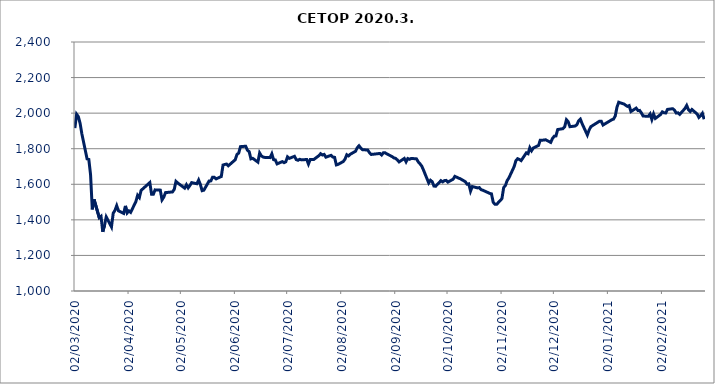
| Category | CETOP |
|---|---|
| 02/03/2020 | 1915.812 |
| 03/03/2020 | 1994.418 |
| 04/03/2020 | 1980.79 |
| 05/03/2020 | 1942.986 |
| 06/03/2020 | 1884.333 |
| 09/03/2020 | 1742.838 |
| 10/03/2020 | 1739.523 |
| 11/03/2020 | 1654.414 |
| 12/03/2020 | 1458.928 |
| 13/03/2020 | 1515.225 |
| 16/03/2020 | 1411.769 |
| 17/03/2020 | 1419.91 |
| 18/03/2020 | 1332.932 |
| 19/03/2020 | 1368.187 |
| 20/03/2020 | 1416.41 |
| 23/03/2020 | 1360.369 |
| 24/03/2020 | 1437.401 |
| 25/03/2020 | 1453.309 |
| 26/03/2020 | 1479.751 |
| 27/03/2020 | 1451.143 |
| 30/03/2020 | 1436.146 |
| 31/03/2020 | 1478.335 |
| 01/04/2020 | 1438.695 |
| 02/04/2020 | 1450.204 |
| 03/04/2020 | 1442.017 |
| 06/04/2020 | 1502.86 |
| 07/04/2020 | 1538.196 |
| 08/04/2020 | 1525.629 |
| 09/04/2020 | 1565.773 |
| 14/04/2020 | 1609.72 |
| 15/04/2020 | 1543.88 |
| 16/04/2020 | 1543.605 |
| 17/04/2020 | 1568.537 |
| 20/04/2020 | 1567.205 |
| 21/04/2020 | 1512.555 |
| 22/04/2020 | 1527.397 |
| 23/04/2020 | 1553.266 |
| 24/04/2020 | 1554.205 |
| 27/04/2020 | 1557.059 |
| 28/04/2020 | 1571.111 |
| 29/04/2020 | 1616.213 |
| 30/04/2020 | 1607.348 |
| 04/05/2020 | 1578.397 |
| 05/05/2020 | 1597.273 |
| 06/05/2020 | 1579.815 |
| 07/05/2020 | 1593.268 |
| 08/05/2020 | 1609.292 |
| 11/05/2020 | 1603.122 |
| 12/05/2020 | 1623.87 |
| 13/05/2020 | 1598.749 |
| 14/05/2020 | 1564.22 |
| 15/05/2020 | 1566.861 |
| 18/05/2020 | 1618.529 |
| 19/05/2020 | 1619.111 |
| 20/05/2020 | 1639.367 |
| 21/05/2020 | 1639.154 |
| 22/05/2020 | 1630.312 |
| 25/05/2020 | 1643.693 |
| 26/05/2020 | 1708.393 |
| 27/05/2020 | 1711.519 |
| 28/05/2020 | 1713.511 |
| 29/05/2020 | 1703.799 |
| 02/06/2020 | 1738.033 |
| 03/06/2020 | 1767.743 |
| 04/06/2020 | 1775.711 |
| 05/06/2020 | 1811.737 |
| 08/06/2020 | 1813.982 |
| 09/06/2020 | 1791.302 |
| 10/06/2020 | 1783.398 |
| 11/06/2020 | 1742.986 |
| 12/06/2020 | 1746.093 |
| 15/06/2020 | 1724.651 |
| 16/06/2020 | 1775.957 |
| 17/06/2020 | 1759.579 |
| 18/06/2020 | 1753.19 |
| 19/06/2020 | 1751.005 |
| 22/06/2020 | 1749.943 |
| 23/06/2020 | 1771.235 |
| 24/06/2020 | 1738.519 |
| 25/06/2020 | 1736.87 |
| 26/06/2020 | 1714.63 |
| 29/06/2020 | 1727.612 |
| 30/06/2020 | 1721.529 |
| 01/07/2020 | 1726.48 |
| 02/07/2020 | 1754.17 |
| 03/07/2020 | 1745.57 |
| 06/07/2020 | 1757.27 |
| 07/07/2020 | 1738.74 |
| 08/07/2020 | 1734.92 |
| 09/07/2020 | 1740.65 |
| 10/07/2020 | 1737.19 |
| 13/07/2020 | 1739.55 |
| 14/07/2020 | 1713.88 |
| 15/07/2020 | 1738.95 |
| 16/07/2020 | 1738.81 |
| 17/07/2020 | 1739.1 |
| 20/07/2020 | 1760.93 |
| 21/07/2020 | 1771.93 |
| 22/07/2020 | 1764.82 |
| 23/07/2020 | 1768 |
| 24/07/2020 | 1752.47 |
| 27/07/2020 | 1762.87 |
| 28/07/2020 | 1752.88 |
| 29/07/2020 | 1751.47 |
| 30/07/2020 | 1708.97 |
| 31/07/2020 | 1711.86 |
| 03/08/2020 | 1728.22 |
| 04/08/2020 | 1741.69 |
| 05/08/2020 | 1766.08 |
| 06/08/2020 | 1759.78 |
| 07/08/2020 | 1768.96 |
| 10/08/2020 | 1785.56 |
| 11/08/2020 | 1805.56 |
| 12/08/2020 | 1816.49 |
| 13/08/2020 | 1803.72 |
| 14/08/2020 | 1794.65 |
| 17/08/2020 | 1792.48 |
| 18/08/2020 | 1777.96 |
| 19/08/2020 | 1767.61 |
| 24/08/2020 | 1773.39 |
| 25/08/2020 | 1764.63 |
| 26/08/2020 | 1777.66 |
| 27/08/2020 | 1777.01 |
| 28/08/2020 | 1770.77 |
| 31/08/2020 | 1755.77 |
| 01/09/2020 | 1748.37 |
| 02/09/2020 | 1745.97 |
| 03/09/2020 | 1736.96 |
| 04/09/2020 | 1725.76 |
| 07/09/2020 | 1745.26 |
| 08/09/2020 | 1726.14 |
| 09/09/2020 | 1744.68 |
| 10/09/2020 | 1740.62 |
| 11/09/2020 | 1745.4 |
| 14/09/2020 | 1742.94 |
| 15/09/2020 | 1725.91 |
| 16/09/2020 | 1714.94 |
| 17/09/2020 | 1702.37 |
| 18/09/2020 | 1679.96 |
| 21/09/2020 | 1607.52 |
| 22/09/2020 | 1622.46 |
| 23/09/2020 | 1614.64 |
| 24/09/2020 | 1589.92 |
| 25/09/2020 | 1589.21 |
| 28/09/2020 | 1620.39 |
| 29/09/2020 | 1613.59 |
| 30/09/2020 | 1620.54 |
| 01/10/2020 | 1621.82 |
| 02/10/2020 | 1612.25 |
| 05/10/2020 | 1628.6 |
| 06/10/2020 | 1644.52 |
| 07/10/2020 | 1640.1 |
| 08/10/2020 | 1635.1 |
| 09/10/2020 | 1631.81 |
| 12/10/2020 | 1614.4 |
| 13/10/2020 | 1600.31 |
| 14/10/2020 | 1602.42 |
| 15/10/2020 | 1561.73 |
| 16/10/2020 | 1587.3 |
| 19/10/2020 | 1579.8 |
| 20/10/2020 | 1581.44 |
| 21/10/2020 | 1570.12 |
| 22/10/2020 | 1566.79 |
| 26/10/2020 | 1548.79 |
| 27/10/2020 | 1546.15 |
| 28/10/2020 | 1498.86 |
| 29/10/2020 | 1487.64 |
| 30/10/2020 | 1487.52 |
| 02/11/2020 | 1519.19 |
| 03/11/2020 | 1581.46 |
| 04/11/2020 | 1593.28 |
| 05/11/2020 | 1620.79 |
| 06/11/2020 | 1635.85 |
| 09/11/2020 | 1699.08 |
| 10/11/2020 | 1732.26 |
| 11/11/2020 | 1743.66 |
| 12/11/2020 | 1739.7 |
| 13/11/2020 | 1733.07 |
| 16/11/2020 | 1776.66 |
| 17/11/2020 | 1772.01 |
| 18/11/2020 | 1805.8 |
| 19/11/2020 | 1788.54 |
| 20/11/2020 | 1803.8 |
| 23/11/2020 | 1818.56 |
| 24/11/2020 | 1848.16 |
| 25/11/2020 | 1847.99 |
| 26/11/2020 | 1848.47 |
| 27/11/2020 | 1850.47 |
| 30/11/2020 | 1835.59 |
| 01/12/2020 | 1857.61 |
| 02/12/2020 | 1870.38 |
| 03/12/2020 | 1871.91 |
| 04/12/2020 | 1907.87 |
| 07/12/2020 | 1912.65 |
| 08/12/2020 | 1922.85 |
| 09/12/2020 | 1962.8 |
| 10/12/2020 | 1952.45 |
| 11/12/2020 | 1923.82 |
| 14/12/2020 | 1927.53 |
| 15/12/2020 | 1935.14 |
| 16/12/2020 | 1956.56 |
| 17/12/2020 | 1965.92 |
| 18/12/2020 | 1940.88 |
| 21/12/2020 | 1877.07 |
| 22/12/2020 | 1904.82 |
| 23/12/2020 | 1923.84 |
| 28/12/2020 | 1954.78 |
| 29/12/2020 | 1954.29 |
| 30/12/2020 | 1933.266 |
| 04/01/2021 | 1962.73 |
| 05/01/2021 | 1966.43 |
| 06/01/2021 | 1983.41 |
| 07/01/2021 | 2033.28 |
| 08/01/2021 | 2061.34 |
| 11/01/2021 | 2051.33 |
| 12/01/2021 | 2044.47 |
| 13/01/2021 | 2037.86 |
| 14/01/2021 | 2042.29 |
| 15/01/2021 | 2009.01 |
| 18/01/2021 | 2028.23 |
| 19/01/2021 | 2015.22 |
| 20/01/2021 | 2015.5 |
| 21/01/2021 | 2001.38 |
| 22/01/2021 | 1983.77 |
| 25/01/2021 | 1982.05 |
| 26/01/2021 | 1995.48 |
| 27/01/2021 | 1964.21 |
| 28/01/2021 | 1995.54 |
| 29/01/2021 | 1970.38 |
| 01/02/2021 | 1991.99 |
| 02/02/2021 | 2007.22 |
| 03/02/2021 | 2001.98 |
| 04/02/2021 | 2000.87 |
| 05/02/2021 | 2021.06 |
| 08/02/2021 | 2024.95 |
| 09/02/2021 | 2016.39 |
| 10/02/2021 | 2000.46 |
| 11/02/2021 | 2001.9 |
| 12/02/2021 | 1993.13 |
| 15/02/2021 | 2026.16 |
| 16/02/2021 | 2043.11 |
| 17/02/2021 | 2019.49 |
| 18/02/2021 | 2009.18 |
| 19/02/2021 | 2020.59 |
| 22/02/2021 | 1995 |
| 23/02/2021 | 1975.92 |
| 24/02/2021 | 1985.63 |
| 25/02/2021 | 1998.97 |
| 26/02/2021 | 1965.68 |